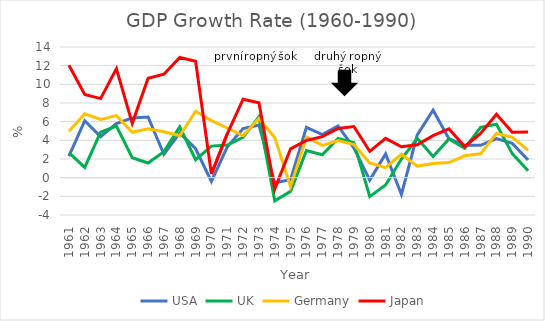
| Category | USA | UK | Germany | Japan |
|---|---|---|---|---|
| 1961.0 | 2.3 | 2.68 | 4.98 | 12.04 |
| 1962.0 | 6.1 | 1.1 | 6.84 | 8.91 |
| 1963.0 | 4.4 | 4.87 | 6.23 | 8.47 |
| 1964.0 | 5.8 | 5.53 | 6.65 | 11.68 |
| 1965.0 | 6.4 | 2.14 | 4.86 | 5.82 |
| 1966.0 | 6.5 | 1.57 | 5.25 | 10.64 |
| 1967.0 | 2.5 | 2.79 | 4.92 | 11.08 |
| 1968.0 | 4.8 | 5.44 | 4.49 | 12.88 |
| 1969.0 | 3.1 | 1.92 | 7.11 | 12.48 |
| 1970.0 | -0.41 | 3.38 | 6.11 | 0.4 |
| 1971.0 | 3.29 | 3.5 | 5.32 | 4.7 |
| 1972.0 | 5.26 | 4.32 | 4.51 | 8.41 |
| 1973.0 | 5.65 | 6.52 | 6.34 | 8.03 |
| 1974.0 | -0.54 | -2.48 | 4.3 | -1.23 |
| 1975.0 | -0.21 | -1.47 | -0.96 | 3.09 |
| 1976.0 | 5.39 | 2.91 | 4.36 | 3.98 |
| 1977.0 | 4.62 | 2.46 | 3.46 | 4.39 |
| 1978.0 | 5.54 | 4.2 | 3.98 | 5.27 |
| 1979.0 | 3.17 | 3.75 | 3.55 | 5.48 |
| 1980.0 | -0.26 | -2.03 | 1.58 | 2.82 |
| 1981.0 | 2.54 | -0.79 | 1.07 | 4.21 |
| 1982.0 | -1.8 | 1.99 | 2.51 | 3.31 |
| 1983.0 | 4.58 | 4.22 | 1.24 | 3.52 |
| 1984.0 | 7.24 | 2.27 | 1.51 | 4.5 |
| 1985.0 | 4.17 | 4.15 | 1.62 | 5.23 |
| 1986.0 | 3.46 | 3.15 | 2.34 | 3.33 |
| 1987.0 | 3.46 | 5.39 | 2.56 | 4.73 |
| 1988.0 | 4.18 | 5.73 | 4.74 | 6.79 |
| 1989.0 | 3.67 | 2.58 | 4.34 | 4.86 |
| 1990.0 | 1.89 | 0.73 | 2.92 | 4.89 |